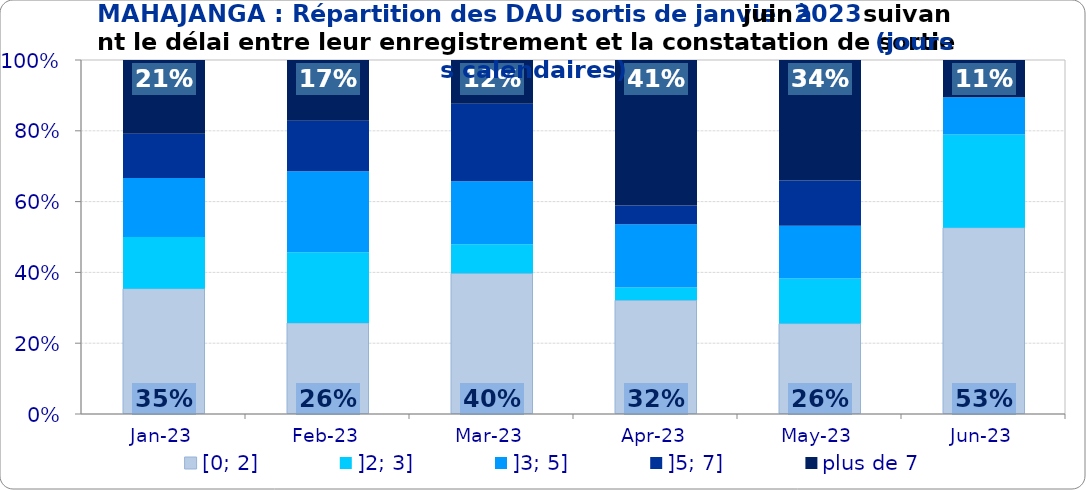
| Category | [0; 2] | ]2; 3] | ]3; 5] | ]5; 7] | plus de 7 |
|---|---|---|---|---|---|
| 2023-01-01 | 0.354 | 0.146 | 0.167 | 0.125 | 0.208 |
| 2023-02-01 | 0.257 | 0.2 | 0.229 | 0.143 | 0.171 |
| 2023-03-01 | 0.397 | 0.082 | 0.178 | 0.219 | 0.123 |
| 2023-04-01 | 0.321 | 0.036 | 0.179 | 0.054 | 0.411 |
| 2023-05-01 | 0.255 | 0.128 | 0.149 | 0.128 | 0.34 |
| 2023-06-01 | 0.526 | 0.263 | 0.105 | 0 | 0.105 |